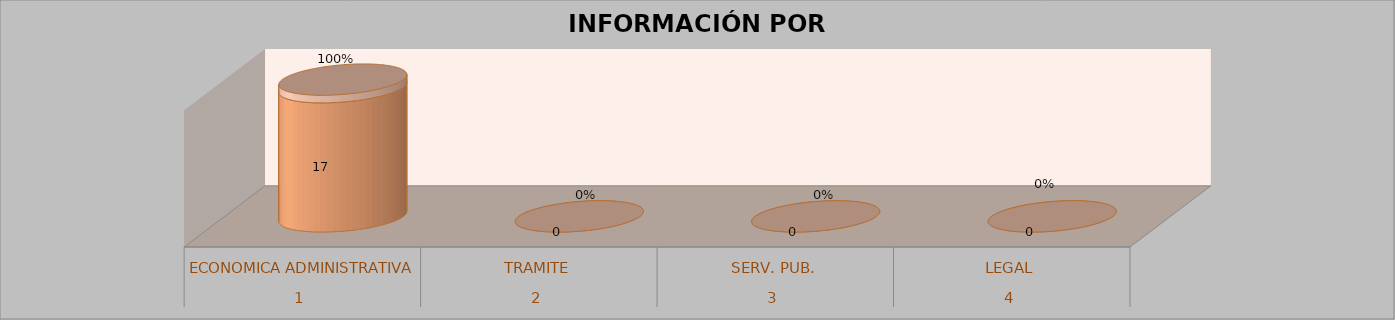
| Category | Series 0 | Series 1 | Series 2 | Series 3 |
|---|---|---|---|---|
| 0 |  |  | 17 | 1 |
| 1 |  |  | 0 | 0 |
| 2 |  |  | 0 | 0 |
| 3 |  |  | 0 | 0 |